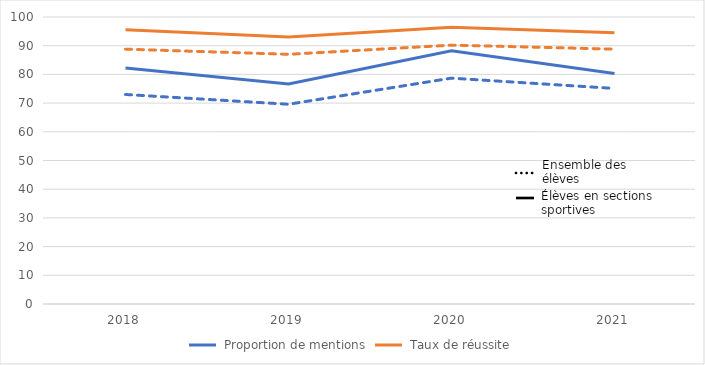
| Category | Series 0 | Series 1 | Ensemble |
|---|---|---|---|
| 2018.0 | 82.2 | 95.6 | 88.8 |
| 2019.0 | 76.7 | 93 | 87 |
| 2020.0 | 88.2 | 96.4 | 90.2 |
| 2021.0 | 80.3 | 94.5 | 88.8 |